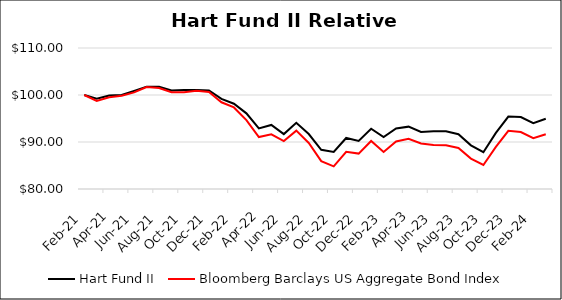
| Category | Hart Fund II | Bloomberg Barclays US Aggregate Bond Index |
|---|---|---|
| 2021-02-01 | 100 | 100 |
| 2021-03-01 | 99.202 | 98.751 |
| 2021-04-01 | 99.91 | 99.531 |
| 2021-05-01 | 99.992 | 99.856 |
| 2021-06-01 | 100.874 | 100.558 |
| 2021-07-01 | 101.775 | 101.682 |
| 2021-08-01 | 101.736 | 101.489 |
| 2021-09-01 | 100.944 | 100.61 |
| 2021-10-01 | 101.076 | 100.582 |
| 2021-11-01 | 101.076 | 100.88 |
| 2021-12-01 | 100.95 | 100.622 |
| 2022-01-01 | 99.164 | 98.454 |
| 2022-02-01 | 98.141 | 97.356 |
| 2022-03-01 | 96.099 | 94.651 |
| 2022-04-01 | 92.879 | 91.059 |
| 2022-05-01 | 93.628 | 91.646 |
| 2022-06-01 | 91.681 | 90.208 |
| 2022-07-01 | 94.068 | 92.413 |
| 2022-08-01 | 91.701 | 89.802 |
| 2022-09-01 | 88.348 | 85.921 |
| 2022-10-01 | 87.884 | 84.808 |
| 2022-11-01 | 90.855 | 87.927 |
| 2022-12-01 | 90.244 | 87.531 |
| 2023-01-01 | 92.83 | 90.224 |
| 2023-02-01 | 91.037 | 87.891 |
| 2023-03-01 | 92.893 | 90.123 |
| 2023-04-01 | 93.266 | 90.67 |
| 2023-05-01 | 92.137 | 89.682 |
| 2023-06-01 | 92.273 | 89.362 |
| 2023-07-01 | 92.289 | 89.301 |
| 2023-08-01 | 91.666 | 88.73 |
| 2023-09-01 | 89.294 | 86.475 |
| 2023-10-01 | 87.834 | 85.111 |
| 2023-11-01 | 91.938 | 88.965 |
| 2023-12-01 | 95.412 | 92.37 |
| 2024-01-01 | 95.303 | 92.116 |
| 2024-02-01 | 93.986 | 90.815 |
| 2024-03-01 | 94.944 | 91.654 |